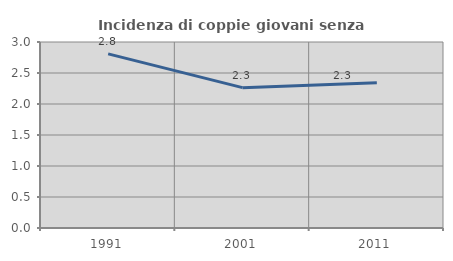
| Category | Incidenza di coppie giovani senza figli |
|---|---|
| 1991.0 | 2.808 |
| 2001.0 | 2.264 |
| 2011.0 | 2.343 |